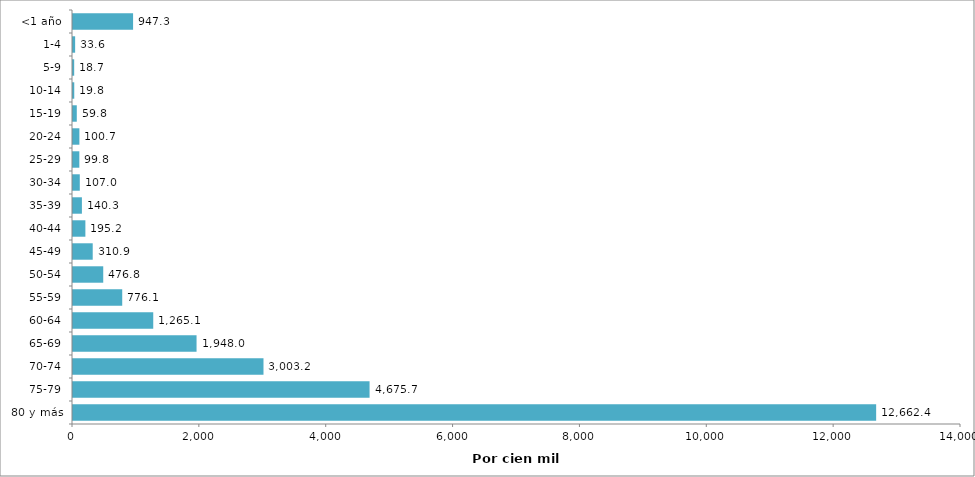
| Category | Tasa de mortalidad específica |
|---|---|
| 80 y más | 12662.372 |
| 75-79 | 4675.659 |
| 70-74 | 3003.198 |
| 65-69 | 1947.975 |
| 60-64 | 1265.083 |
| 55-59 | 776.138 |
| 50-54 | 476.767 |
| 45-49 | 310.875 |
| 40-44 | 195.204 |
| 35-39 | 140.336 |
| 30-34 | 107.046 |
| 25-29 | 99.801 |
| 20-24 | 100.735 |
| 15-19 | 59.778 |
| 10-14 | 19.786 |
| 5-9 | 18.728 |
| 1-4 | 33.648 |
| <1 año | 947.285 |